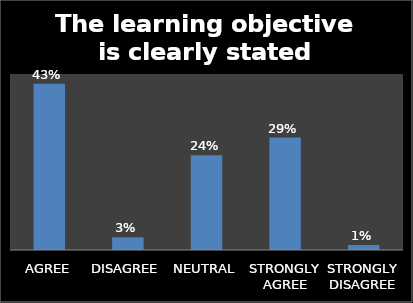
| Category | Series 0 |
|---|---|
| AGREE | 0.425 |
| DISAGREE | 0.032 |
| NEUTRAL | 0.243 |
| STRONGLY AGREE | 0.288 |
| STRONGLY DISAGREE | 0.012 |